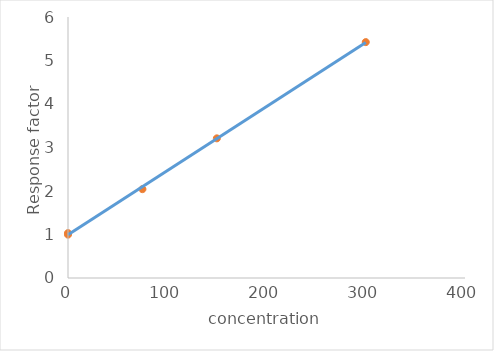
| Category | Series 0 |
|---|---|
| 0.0 | 1.032 |
| 0.0 | 0.997 |
| 75.0 | 2.042 |
| 150.0 | 3.21 |
| 300.0 | 5.423 |
| nan | 0 |
| nan | 0 |
| nan | 0 |
| nan | 0 |